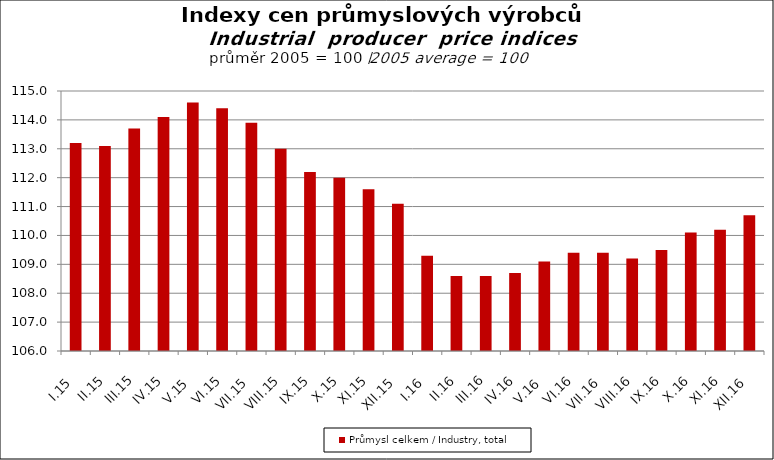
| Category | Průmysl celkem / Industry, total |
|---|---|
| I.15 | 113.2 |
| II.15 | 113.1 |
| III.15 | 113.7 |
| IV.15 | 114.1 |
| V.15 | 114.6 |
| VI.15 | 114.4 |
| VII.15 | 113.9 |
| VIII.15 | 113 |
| IX.15 | 112.2 |
| X.15 | 112 |
| XI.15 | 111.6 |
| XII.15 | 111.1 |
| I.16 | 109.3 |
| II.16 | 108.6 |
| III.16 | 108.6 |
| IV.16 | 108.7 |
| V.16 | 109.1 |
| VI.16 | 109.4 |
| VII.16 | 109.4 |
| VIII.16 | 109.2 |
| IX.16 | 109.5 |
| X.16 | 110.1 |
| XI.16 | 110.2 |
| XII.16 | 110.7 |